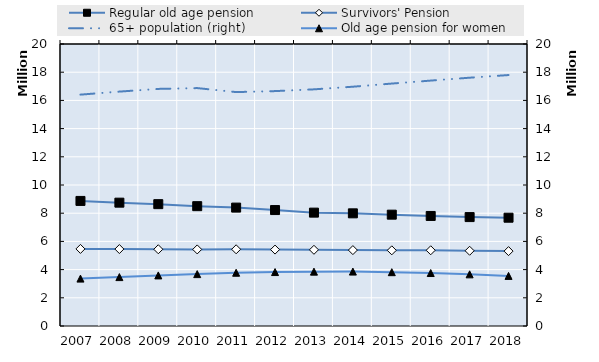
| Category | Regular old age pension | Survivors' Pension | 0 | Series 14 | Series 15 | Series 16 | Series 17 | Series 18 | Series 19 |
|---|---|---|---|---|---|---|---|---|---|
| 2007.0 | 8870011 | 5467496 |  |  |  |  |  |  |  |
| 2008.0 | 8747229 | 5456915 |  |  |  |  |  |  |  |
| 2009.0 | 8641729 | 5442864 |  |  |  |  |  |  |  |
| 2010.0 | 8498691 | 5431720 |  |  |  |  |  |  |  |
| 2011.0 | 8396810 | 5440160 |  |  |  |  |  |  |  |
| 2012.0 | 8223520 | 5419303 |  |  |  |  |  |  |  |
| 2013.0 | 8039899 | 5403410 |  |  |  |  |  |  |  |
| 2014.0 | 7990096 | 5383047 |  |  |  |  |  |  |  |
| 2015.0 | 7895897 | 5366389 |  |  |  |  |  |  |  |
| 2016.0 | 7804006 | 5370252 |  |  |  |  |  |  |  |
| 2017.0 | 7724728 | 5336664 |  |  |  |  |  |  |  |
| 2018.0 | 7680279 | 5311373 |  |  |  |  |  |  |  |